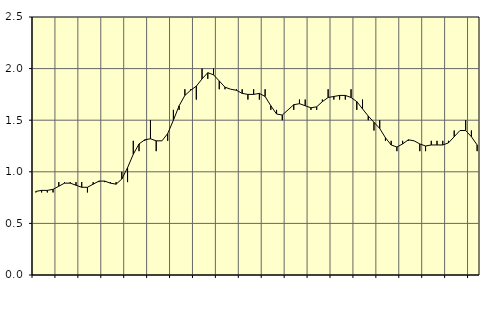
| Category | Piggar | Sysselsatta utomlands |
|---|---|---|
| nan | 0.8 | 0.81 |
| 1.0 | 0.8 | 0.82 |
| 1.0 | 0.8 | 0.82 |
| 1.0 | 0.8 | 0.83 |
| nan | 0.9 | 0.86 |
| 2.0 | 0.9 | 0.89 |
| 2.0 | 0.9 | 0.89 |
| 2.0 | 0.9 | 0.87 |
| nan | 0.9 | 0.85 |
| 3.0 | 0.8 | 0.85 |
| 3.0 | 0.9 | 0.88 |
| 3.0 | 0.9 | 0.91 |
| nan | 0.9 | 0.91 |
| 4.0 | 0.9 | 0.89 |
| 4.0 | 0.9 | 0.88 |
| 4.0 | 1 | 0.93 |
| nan | 0.9 | 1.04 |
| 5.0 | 1.3 | 1.17 |
| 5.0 | 1.2 | 1.27 |
| 5.0 | 1.3 | 1.31 |
| nan | 1.5 | 1.32 |
| 6.0 | 1.2 | 1.3 |
| 6.0 | 1.3 | 1.3 |
| 6.0 | 1.3 | 1.37 |
| nan | 1.6 | 1.5 |
| 7.0 | 1.6 | 1.64 |
| 7.0 | 1.8 | 1.74 |
| 7.0 | 1.8 | 1.79 |
| nan | 1.7 | 1.83 |
| 8.0 | 2 | 1.9 |
| 8.0 | 1.9 | 1.96 |
| 8.0 | 2 | 1.94 |
| nan | 1.8 | 1.88 |
| 9.0 | 1.8 | 1.82 |
| 9.0 | 1.8 | 1.8 |
| 9.0 | 1.8 | 1.79 |
| nan | 1.8 | 1.76 |
| 10.0 | 1.7 | 1.75 |
| 10.0 | 1.8 | 1.75 |
| 10.0 | 1.7 | 1.76 |
| nan | 1.8 | 1.73 |
| 11.0 | 1.6 | 1.64 |
| 11.0 | 1.6 | 1.56 |
| 11.0 | 1.5 | 1.55 |
| nan | 1.6 | 1.6 |
| 12.0 | 1.6 | 1.65 |
| 12.0 | 1.7 | 1.66 |
| 12.0 | 1.7 | 1.64 |
| nan | 1.6 | 1.62 |
| 13.0 | 1.6 | 1.63 |
| 13.0 | 1.7 | 1.68 |
| 13.0 | 1.8 | 1.72 |
| nan | 1.7 | 1.73 |
| 14.0 | 1.7 | 1.74 |
| 14.0 | 1.7 | 1.74 |
| 14.0 | 1.8 | 1.72 |
| nan | 1.6 | 1.68 |
| 15.0 | 1.7 | 1.61 |
| 15.0 | 1.5 | 1.54 |
| 15.0 | 1.4 | 1.48 |
| nan | 1.5 | 1.42 |
| 16.0 | 1.3 | 1.33 |
| 16.0 | 1.3 | 1.26 |
| 16.0 | 1.2 | 1.24 |
| nan | 1.3 | 1.27 |
| 17.0 | 1.3 | 1.31 |
| 17.0 | 1.3 | 1.3 |
| 17.0 | 1.2 | 1.27 |
| nan | 1.2 | 1.25 |
| 18.0 | 1.3 | 1.26 |
| 18.0 | 1.3 | 1.26 |
| 18.0 | 1.3 | 1.26 |
| nan | 1.3 | 1.28 |
| 19.0 | 1.4 | 1.34 |
| 19.0 | 1.4 | 1.4 |
| 19.0 | 1.5 | 1.4 |
| nan | 1.4 | 1.34 |
| 20.0 | 1.2 | 1.26 |